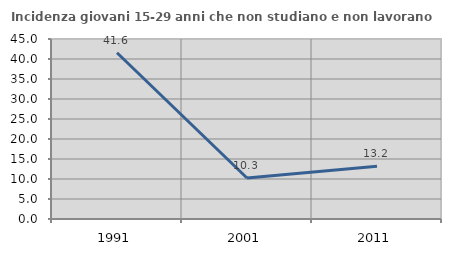
| Category | Incidenza giovani 15-29 anni che non studiano e non lavorano  |
|---|---|
| 1991.0 | 41.559 |
| 2001.0 | 10.256 |
| 2011.0 | 13.208 |